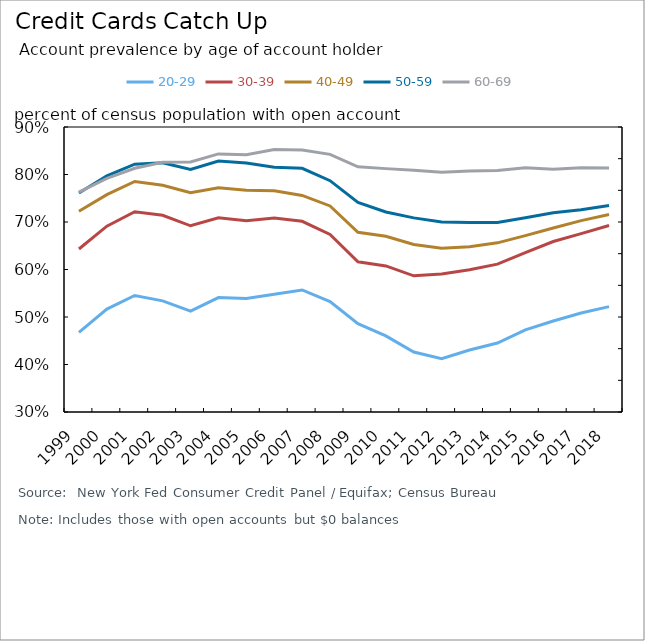
| Category | 20-29 | 30-39 | 40-49 | 50-59 |
|---|---|---|---|---|
| 1999.0 | 0.468 | 0.643 | 0.723 | 0.761 |
| 2000.0 | 0.517 | 0.691 | 0.758 | 0.797 |
| 2001.0 | 0.545 | 0.722 | 0.785 | 0.822 |
| 2002.0 | 0.534 | 0.714 | 0.777 | 0.825 |
| 2003.0 | 0.512 | 0.692 | 0.761 | 0.811 |
| 2004.0 | 0.541 | 0.709 | 0.772 | 0.828 |
| 2005.0 | 0.539 | 0.703 | 0.767 | 0.824 |
| 2006.0 | 0.548 | 0.708 | 0.766 | 0.815 |
| 2007.0 | 0.557 | 0.701 | 0.756 | 0.813 |
| 2008.0 | 0.532 | 0.674 | 0.734 | 0.787 |
| 2009.0 | 0.486 | 0.616 | 0.678 | 0.741 |
| 2010.0 | 0.46 | 0.608 | 0.67 | 0.721 |
| 2011.0 | 0.426 | 0.587 | 0.653 | 0.709 |
| 2012.0 | 0.412 | 0.591 | 0.645 | 0.7 |
| 2013.0 | 0.43 | 0.599 | 0.648 | 0.699 |
| 2014.0 | 0.445 | 0.611 | 0.656 | 0.699 |
| 2015.0 | 0.473 | 0.636 | 0.671 | 0.709 |
| 2016.0 | 0.492 | 0.659 | 0.687 | 0.719 |
| 2017.0 | 0.509 | 0.676 | 0.703 | 0.726 |
| 2018.0 | 0.522 | 0.693 | 0.716 | 0.735 |